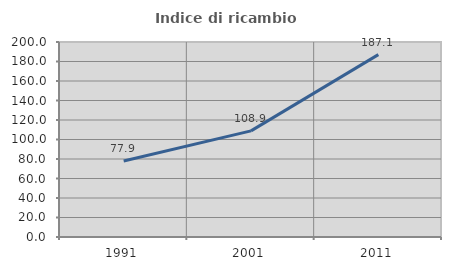
| Category | Indice di ricambio occupazionale  |
|---|---|
| 1991.0 | 77.871 |
| 2001.0 | 108.858 |
| 2011.0 | 187.065 |